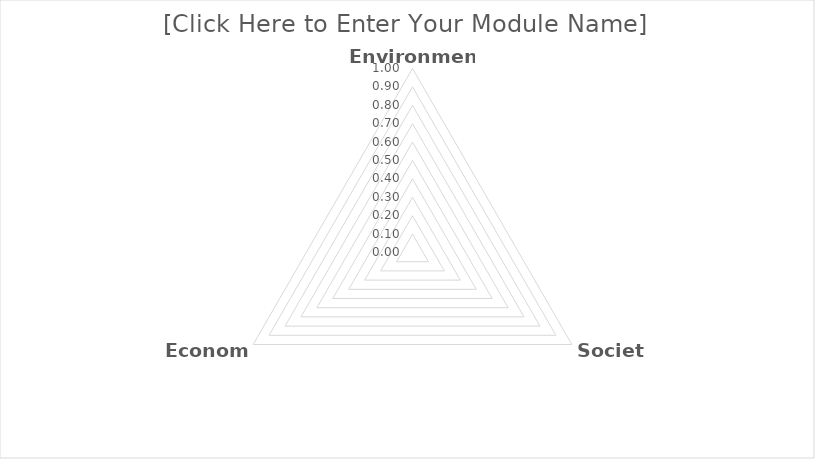
| Category | Series 0 |
|---|---|
| Environment | 0 |
| Society | 0 |
| Economy | 0 |